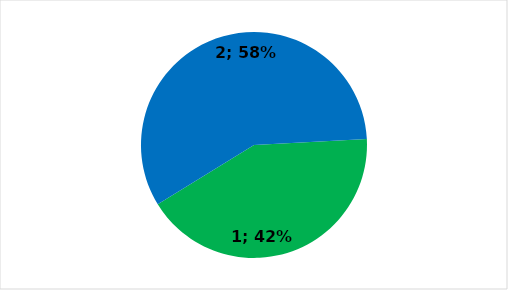
| Category | Series 0 |
|---|---|
| 0 | 241 |
| 1 | 332 |